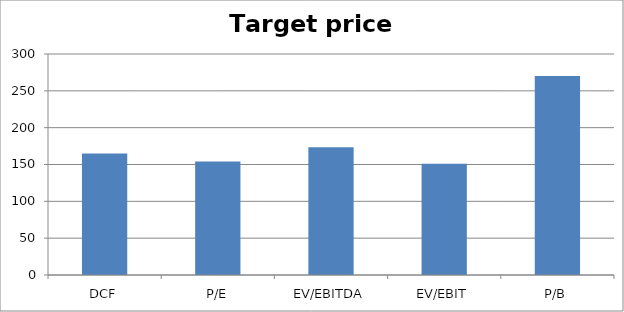
| Category | Target price |
|---|---|
| DCF | 164.908 |
| P/E | 154.149 |
| EV/EBITDA | 173.41 |
| EV/EBIT | 151.139 |
| P/B | 270.114 |